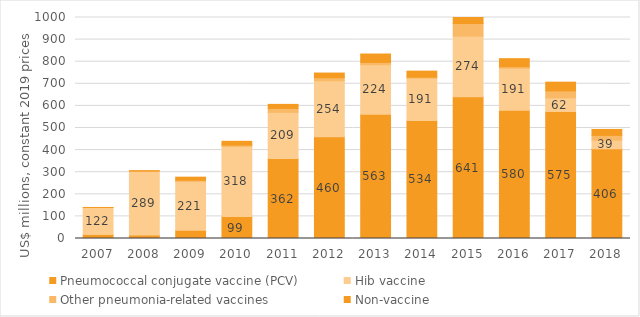
| Category | Pneumococcal conjugate vaccine (PCV) | Hib vaccine | Other pneumonia-related vaccines | Non-vaccine |
|---|---|---|---|---|
| 2007.0 | 18.233 | 121.99 | 0 | 0.239 |
| 2008.0 | 15.455 | 289.002 | 0 | 2.627 |
| 2009.0 | 37.355 | 221.403 | 4.851 | 13.961 |
| 2010.0 | 99.086 | 317.765 | 5.777 | 17.185 |
| 2011.0 | 361.524 | 209.381 | 17.673 | 18.279 |
| 2012.0 | 460.272 | 253.503 | 13.617 | 21.221 |
| 2013.0 | 562.501 | 223.771 | 10.434 | 38.097 |
| 2014.0 | 534.174 | 191.451 | 4.397 | 27.373 |
| 2015.0 | 641.376 | 274.284 | 57.125 | 33.586 |
| 2016.0 | 579.957 | 190.619 | 6.91 | 36.334 |
| 2017.0 | 574.611 | 62.089 | 31.131 | 39.609 |
| 2018.0 | 405.923 | 39.278 | 21.572 | 26.735 |